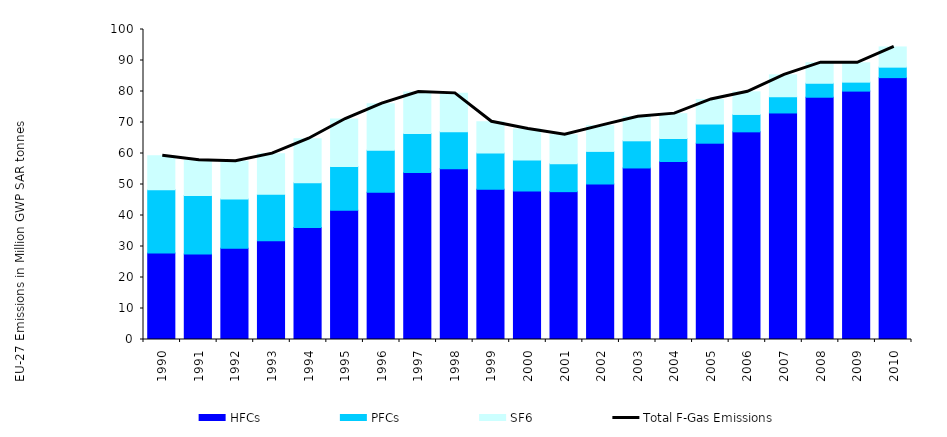
| Category | HFCs | PFCs | SF6 |
|---|---|---|---|
| 1990.0 | 27.887 | 20.453 | 10.928 |
| 1991.0 | 27.543 | 18.913 | 11.371 |
| 1992.0 | 29.443 | 15.844 | 12.196 |
| 1993.0 | 31.846 | 14.976 | 13.138 |
| 1994.0 | 36.148 | 14.392 | 14.22 |
| 1995.0 | 41.672 | 14.126 | 15.315 |
| 1996.0 | 47.467 | 13.584 | 15.034 |
| 1997.0 | 53.867 | 12.615 | 13.325 |
| 1998.0 | 55.085 | 11.964 | 12.348 |
| 1999.0 | 48.491 | 11.656 | 10.102 |
| 2000.0 | 47.88 | 9.984 | 10.017 |
| 2001.0 | 47.693 | 9.004 | 9.383 |
| 2002.0 | 50.166 | 10.513 | 8.317 |
| 2003.0 | 55.334 | 8.759 | 7.748 |
| 2004.0 | 57.419 | 7.428 | 8.011 |
| 2005.0 | 63.322 | 6.189 | 7.925 |
| 2006.0 | 66.986 | 5.61 | 7.302 |
| 2007.0 | 73.074 | 5.235 | 7.064 |
| 2008.0 | 78.153 | 4.505 | 6.633 |
| 2009.0 | 80.125 | 2.893 | 6.238 |
| 2010.0 | 84.476 | 3.38 | 6.511 |